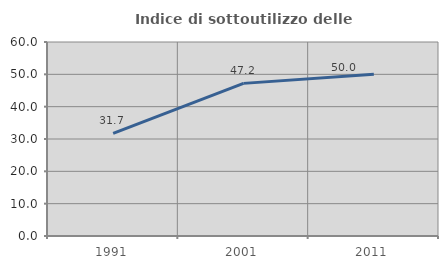
| Category | Indice di sottoutilizzo delle abitazioni  |
|---|---|
| 1991.0 | 31.746 |
| 2001.0 | 47.204 |
| 2011.0 | 50 |